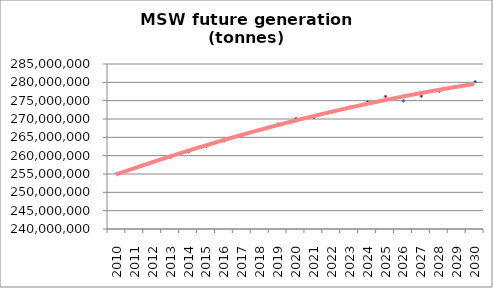
| Category | Series 0 |
|---|---|
| 2010.0 | 255147000 |
| 2011.0 | 256608734.308 |
| 2012.0 | 258078842.875 |
| 2013.0 | 259557373.679 |
| 2014.0 | 261044374.968 |
| 2015.0 | 262539895.271 |
| 2016.0 | 264043983.393 |
| 2017.0 | 265556688.42 |
| 2018.0 | 267078059.716 |
| 2019.0 | 268608146.932 |
| 2020.0 | 270147000 |
| 2021.0 | 270383612.363 |
| 2022.0 | 271813083.222 |
| 2023.0 | 273250111.442 |
| 2024.0 | 274694736.98 |
| 2025.0 | 276147000 |
| 2026.0 | 274958325.42 |
| 2027.0 | 276246414.356 |
| 2028.0 | 277540537.564 |
| 2029.0 | 278840723.312 |
| 2030.0 | 280147000 |